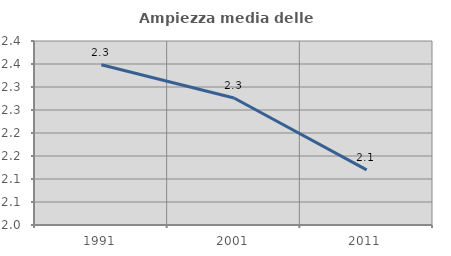
| Category | Ampiezza media delle famiglie |
|---|---|
| 1991.0 | 2.348 |
| 2001.0 | 2.276 |
| 2011.0 | 2.12 |